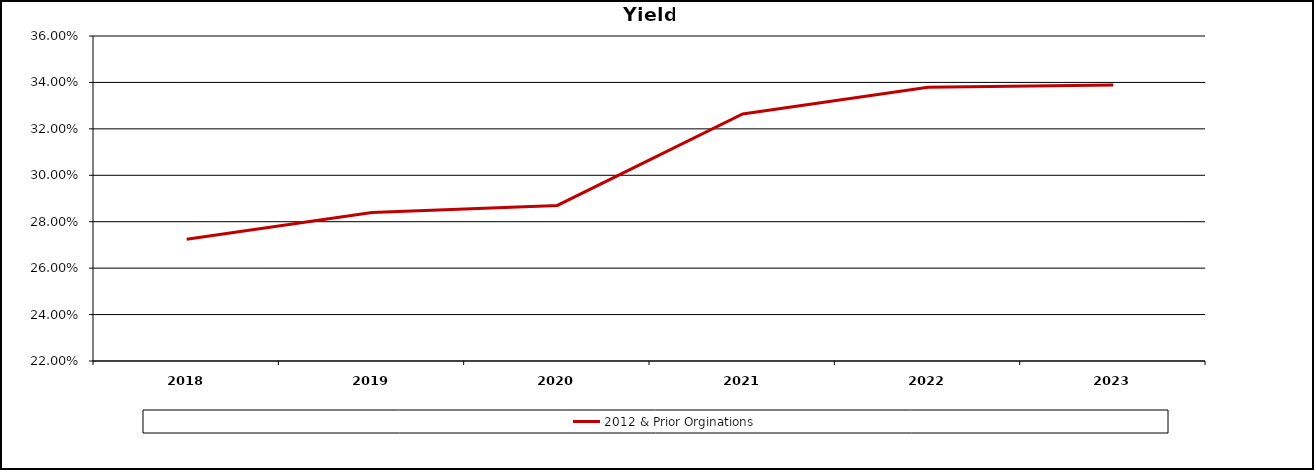
| Category | 2012 & Prior Orginations |
|---|---|
| 2018 | 0.272 |
| 2019 | 0.284 |
| 2020 | 0.287 |
| 2021 | 0.326 |
| 2022 | 0.338 |
| 2023 | 0.339 |